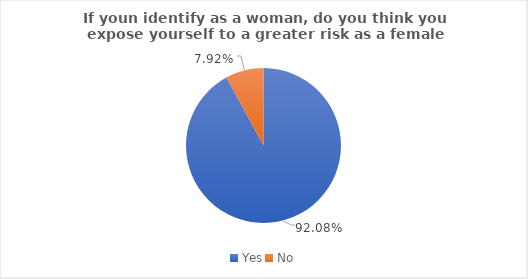
| Category | Series 0 |
|---|---|
| Yes | 0.921 |
| No | 0.079 |